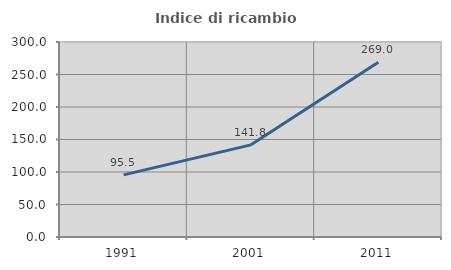
| Category | Indice di ricambio occupazionale  |
|---|---|
| 1991.0 | 95.522 |
| 2001.0 | 141.772 |
| 2011.0 | 269.014 |